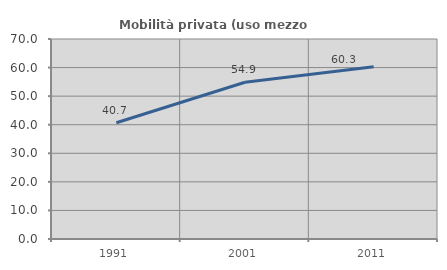
| Category | Mobilità privata (uso mezzo privato) |
|---|---|
| 1991.0 | 40.668 |
| 2001.0 | 54.862 |
| 2011.0 | 60.306 |